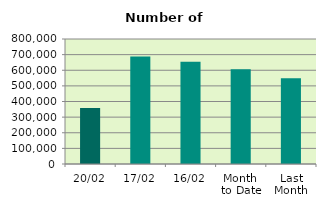
| Category | Series 0 |
|---|---|
| 20/02 | 357608 |
| 17/02 | 688268 |
| 16/02 | 654850 |
| Month 
to Date | 607170.571 |
| Last
Month | 549126.273 |